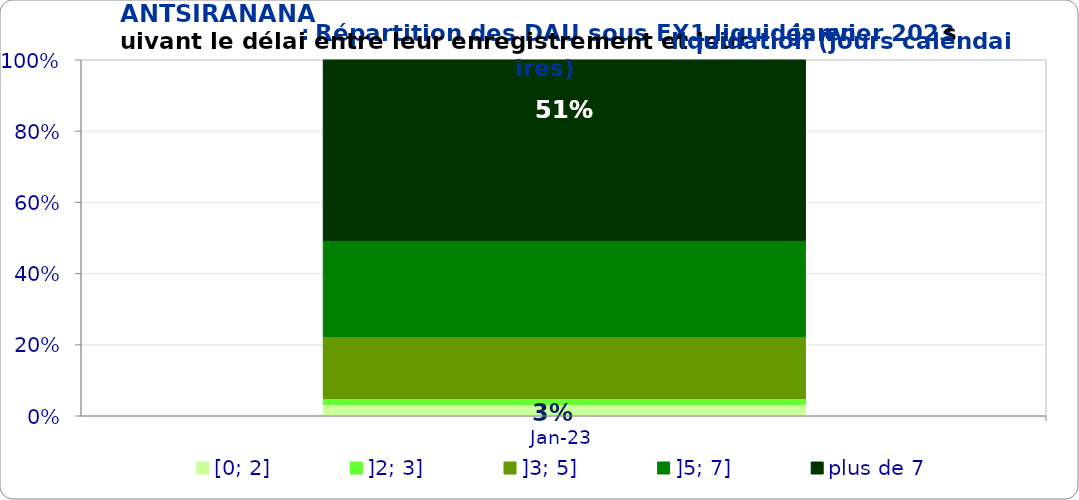
| Category | [0; 2] | ]2; 3] | ]3; 5] | ]5; 7] | plus de 7 |
|---|---|---|---|---|---|
| 2023-01-01 | 0.032 | 0.016 | 0.175 | 0.27 | 0.508 |